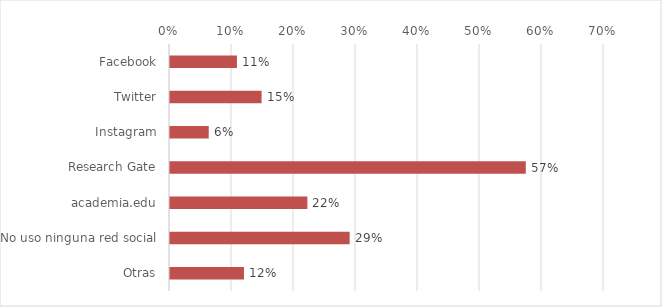
| Category | Series 1 |
|---|---|
| Facebook | 0.108 |
| Twitter | 0.148 |
| Instagram | 0.062 |
| Research Gate | 0.574 |
| academia.edu | 0.222 |
| No uso ninguna red social | 0.29 |
| Otras | 0.119 |